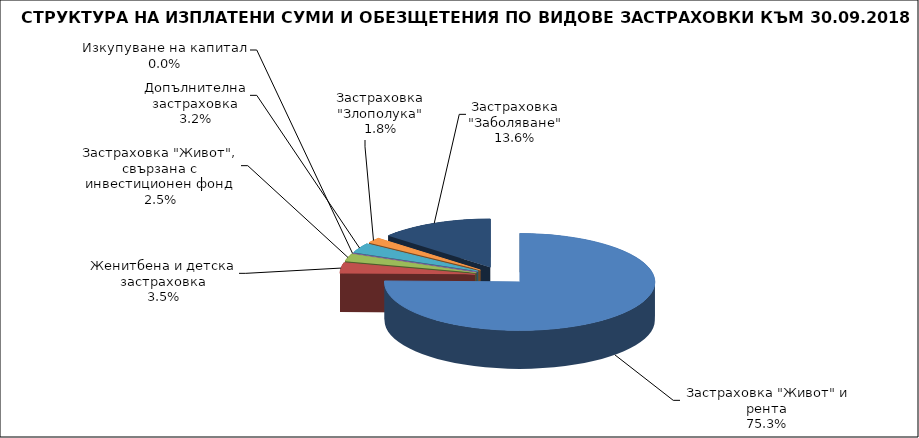
| Category | Series 0 |
|---|---|
|  Застраховка "Живот" и рента | 78428539.244 |
| Женитбена и детска застраховка | 3672301.99 |
| Застраховка "Живот", свързана с инвестиционен фонд | 2622267.212 |
| Изкупуване на капитал | 0 |
| Допълнителна застраховка | 3350721.181 |
| Застраховка "Злополука" | 1873220.78 |
| Застраховка "Заболяване" | 14185734.873 |